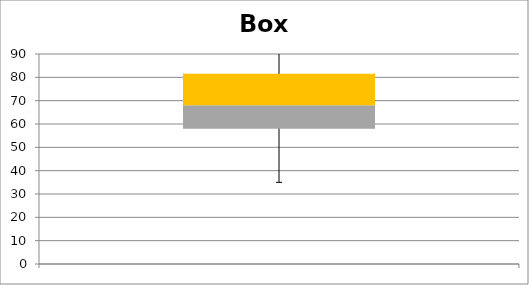
| Category | Min | Q1-Min | Med-Q1 | Q3-Med |
|---|---|---|---|---|
|  | 35 | 23 | 10 | 13.5 |